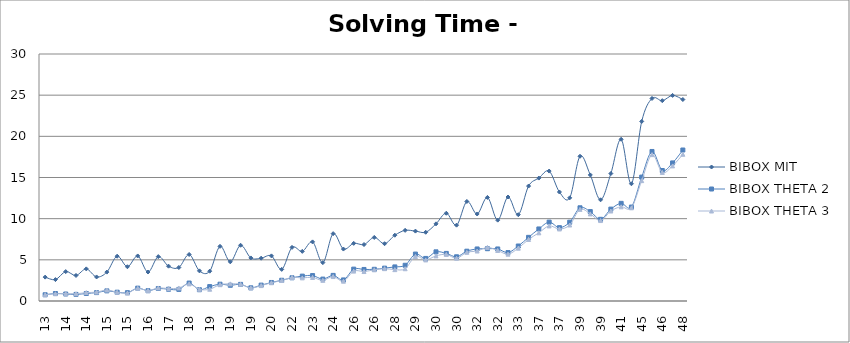
| Category | BIBOX MIT | BIBOX THETA 2 | BIBOX THETA 3 |
|---|---|---|---|
| 13.0 | 2.9 | 0.76 | 0.76 |
| 14.0 | 2.6 | 0.91 | 0.88 |
| 14.0 | 3.57 | 0.85 | 0.9 |
| 14.0 | 3.1 | 0.8 | 0.88 |
| 14.0 | 3.9 | 0.91 | 1.02 |
| 15.0 | 2.92 | 1.02 | 1.08 |
| 15.0 | 3.51 | 1.23 | 1.33 |
| 15.0 | 5.44 | 1.07 | 1.07 |
| 15.0 | 4.16 | 1.01 | 0.96 |
| 16.0 | 5.47 | 1.56 | 1.55 |
| 16.0 | 3.52 | 1.25 | 1.26 |
| 17.0 | 5.39 | 1.52 | 1.58 |
| 17.0 | 4.23 | 1.43 | 1.52 |
| 17.0 | 4.07 | 1.41 | 1.58 |
| 18.0 | 5.65 | 2.18 | 2.08 |
| 18.0 | 3.66 | 1.37 | 1.42 |
| 19.0 | 3.62 | 1.75 | 1.43 |
| 19.0 | 6.64 | 2.04 | 1.98 |
| 19.0 | 4.76 | 1.91 | 2.08 |
| 19.0 | 6.77 | 2.02 | 2.04 |
| 19.0 | 5.23 | 1.6 | 1.58 |
| 19.0 | 5.2 | 1.93 | 1.87 |
| 20.0 | 5.48 | 2.25 | 2.22 |
| 22.0 | 3.84 | 2.52 | 2.49 |
| 22.0 | 6.51 | 2.82 | 2.86 |
| 23.0 | 6.03 | 3.02 | 2.81 |
| 23.0 | 7.18 | 3.09 | 2.86 |
| 23.0 | 4.66 | 2.66 | 2.51 |
| 24.0 | 8.18 | 3.11 | 2.97 |
| 24.0 | 6.31 | 2.56 | 2.41 |
| 26.0 | 7 | 3.87 | 3.63 |
| 26.0 | 6.86 | 3.83 | 3.58 |
| 26.0 | 7.72 | 3.85 | 3.79 |
| 27.0 | 6.96 | 3.99 | 3.93 |
| 28.0 | 7.99 | 4.14 | 3.81 |
| 28.0 | 8.58 | 4.34 | 3.92 |
| 29.0 | 8.49 | 5.7 | 5.41 |
| 29.0 | 8.35 | 5.17 | 4.99 |
| 30.0 | 9.37 | 5.97 | 5.48 |
| 30.0 | 10.66 | 5.78 | 5.66 |
| 30.0 | 9.21 | 5.37 | 5.19 |
| 31.0 | 12.09 | 6.05 | 5.91 |
| 32.0 | 10.57 | 6.32 | 6.07 |
| 32.0 | 12.58 | 6.35 | 6.51 |
| 32.0 | 9.82 | 6.32 | 6.14 |
| 32.0 | 12.63 | 5.88 | 5.69 |
| 33.0 | 10.48 | 6.68 | 6.42 |
| 34.0 | 13.96 | 7.73 | 7.48 |
| 37.0 | 14.93 | 8.75 | 8.28 |
| 37.0 | 15.78 | 9.58 | 9.12 |
| 37.0 | 13.24 | 8.91 | 8.75 |
| 37.0 | 12.53 | 9.57 | 9.23 |
| 39.0 | 17.58 | 11.32 | 11.13 |
| 39.0 | 15.31 | 10.86 | 10.58 |
| 39.0 | 12.29 | 9.92 | 9.77 |
| 40.0 | 15.48 | 11.16 | 10.93 |
| 41.0 | 19.64 | 11.86 | 11.44 |
| 41.0 | 14.24 | 11.41 | 11.32 |
| 45.0 | 21.81 | 15.05 | 14.62 |
| 46.0 | 24.6 | 18.16 | 17.78 |
| 46.0 | 24.33 | 15.85 | 15.62 |
| 46.0 | 24.97 | 16.77 | 16.41 |
| 48.0 | 24.47 | 18.34 | 17.82 |